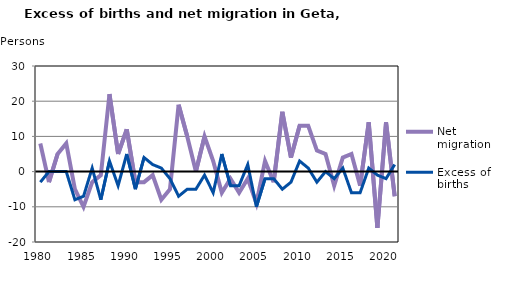
| Category | Net migration | Excess of births |
|---|---|---|
| 1980.0 | 8 | -3 |
| 1981.0 | -3 | 0 |
| 1982.0 | 5 | 0 |
| 1983.0 | 8 | 0 |
| 1984.0 | -5 | -8 |
| 1985.0 | -10 | -7 |
| 1986.0 | -3 | 1 |
| 1987.0 | -1 | -8 |
| 1988.0 | 22 | 3 |
| 1989.0 | 5 | -4 |
| 1990.0 | 12 | 5 |
| 1991.0 | -3 | -5 |
| 1992.0 | -3 | 4 |
| 1993.0 | -1 | 2 |
| 1994.0 | -8 | 1 |
| 1995.0 | -5 | -2 |
| 1996.0 | 19 | -7 |
| 1997.0 | 10 | -5 |
| 1998.0 | 0 | -5 |
| 1999.0 | 10 | -1 |
| 2000.0 | 3 | -6 |
| 2001.0 | -6 | 5 |
| 2002.0 | -2 | -4 |
| 2003.0 | -6 | -4 |
| 2004.0 | -2 | 2 |
| 2005.0 | -9 | -10 |
| 2006.0 | 3 | -2 |
| 2007.0 | -3 | -2 |
| 2008.0 | 17 | -5 |
| 2009.0 | 4 | -3 |
| 2010.0 | 13 | 3 |
| 2011.0 | 13 | 1 |
| 2012.0 | 6 | -3 |
| 2013.0 | 5 | 0 |
| 2014.0 | -4 | -2 |
| 2015.0 | 4 | 1 |
| 2016.0 | 5 | -6 |
| 2017.0 | -4 | -6 |
| 2018.0 | 14 | 1 |
| 2019.0 | -16 | -1 |
| 2020.0 | 14 | -2 |
| 2021.0 | -7 | 2 |